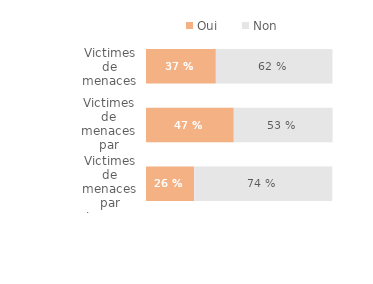
| Category | Oui | Non |
|---|---|---|
| Victimes de menaces par inconnu | 0.257 | 0.739 |
| Victimes de menaces par personne connue | 0.469 | 0.528 |
| Victimes de menaces | 0.374 | 0.624 |